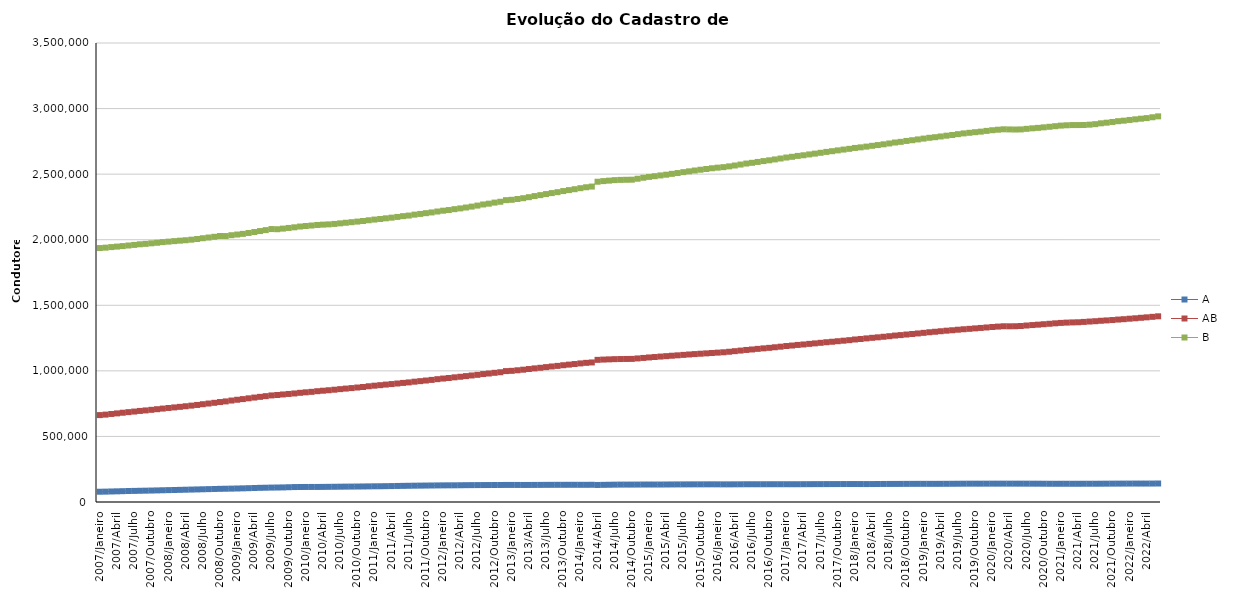
| Category | A | AB | B |
|---|---|---|---|
| 2007/Janeiro | 78339 | 662687 | 1936381 |
| 2007/Fevereiro | 79078 | 666322 | 1939479 |
| 2007/Março | 80256 | 671259 | 1943715 |
| 2007/Abril | 81364 | 675754 | 1947564 |
| 2007/Maio | 82551 | 680772 | 1951491 |
| 2007/Junho | 83749 | 685305 | 1955838 |
| 2007/Julho | 84645 | 689669 | 1960327 |
| 2007/Agosto | 85630 | 694408 | 1965165 |
| 2007/Setembro | 86399 | 698346 | 1968387 |
| 2007/Outubro | 87316 | 702912 | 1972538 |
| 2007/Novembro | 88339 | 707624 | 1976788 |
| 2007/Dezembro | 89528 | 712351 | 1981782 |
| 2008/Janeiro | 90600 | 716994 | 1985306 |
| 2008/Fevereiro | 91598 | 721215 | 1989171 |
| 2008/Março | 92619 | 725560 | 1992712 |
| 2008/Abril | 93708 | 730139 | 1995923 |
| 2008/Maio | 94834 | 734945 | 2000343 |
| 2008/Junho | 95853 | 739988 | 2005357 |
| 2008/Julho | 97010 | 745721 | 2011362 |
| 2008/Agosto | 98183 | 750891 | 2016749 |
| 2008/Setembro | 99339 | 756352 | 2022267 |
| 2008/Outubro | 100406 | 762253 | 2028505 |
| 2008/Novembro | 101206 | 767035 | 2027963 |
| 2008/Dezembro | 101984 | 773761 | 2034277 |
| 2009/Janeiro | 103037 | 779599 | 2039448 |
| 2009/Fevereiro | 104093 | 784637 | 2044637 |
| 2009/Março | 105435 | 790605 | 2051447 |
| 2009/Abril | 106757 | 796329 | 2058576 |
| 2009/Maio | 108079 | 801836 | 2065963 |
| 2009/Junho | 108964 | 807138 | 2073013 |
| 2009/Julho | 109948 | 812681 | 2081324 |
| 2009/Agosto | 110476 | 815980 | 2079988 |
| 2009/Setembro | 111217 | 820035 | 2084657 |
| 2009/Outubro | 112605 | 823940 | 2089744 |
| 2009/Novembro | 113921 | 827629 | 2094557 |
| 2009/Dezembro | 114420 | 832595 | 2100453 |
| 2010/Janeiro | 114636 | 836465 | 2104634 |
| 2010/Fevereiro | 114770 | 839928 | 2108253 |
| 2010/Março | 114809 | 844821 | 2112440 |
| 2010/Abril | 115140 | 848547 | 2115005 |
| 2010/Maio | 115639 | 852175 | 2117066 |
| 2010/Junho | 116176 | 856224 | 2120380 |
| 2010/Julho | 116713 | 860603 | 2124778 |
| 2010/Agosto | 117242 | 864813 | 2129320 |
| 2010/Setembro | 117593 | 868600 | 2133645 |
| 2010/Outubro | 118048 | 872947 | 2138176 |
| 2010/Novembro | 118496 | 877093 | 2142847 |
| 2010/Dezembro | 119150 | 882503 | 2148315 |
| 2011/Janeiro | 119745 | 886853 | 2153596 |
| 2011/Fevereiro | 120114 | 890841 | 2157800 |
| 2011/Março | 120776 | 895331 | 2163141 |
| 2011/Abril | 121472 | 899305 | 2168170 |
| 2011/Maio | 122333 | 903633 | 2173821 |
| 2011/Junho | 123012 | 908086 | 2179733 |
| 2011/Julho | 123705 | 911994 | 2184166 |
| 2011/Agosto | 124386 | 917379 | 2191164 |
| 2011/Setembro | 124879 | 921583 | 2196566 |
| 2011/Outubro | 125381 | 926225 | 2202361 |
| 2011/Novembro | 125899 | 931073 | 2208147 |
| 2011/Dezembro | 126447 | 936539 | 2215021 |
| 2012/Janeiro | 126877 | 941330 | 2221296 |
| 2012/Fevereiro | 127117 | 945491 | 2226229 |
| 2012/Março | 127325 | 950538 | 2232874 |
| 2012/Abril | 127754 | 954904 | 2238686 |
| 2012/Maio | 128324 | 959959 | 2245535 |
| 2012/Junho | 128674 | 964784 | 2252453 |
| 2012/Julho | 128992 | 969723 | 2260185 |
| 2012/Agosto | 129202 | 975564 | 2268721 |
| 2012/Setembro | 129369 | 979853 | 2274812 |
| 2012/Outubro | 129609 | 985089 | 2282984 |
| 2012/Novembro | 129852 | 989534 | 2289455 |
| 2012/Dezembro | 130177 | 998134 | 2301652 |
| 2013/Janeiro | 130177 | 1000109 | 2304385 |
| 2013/Fevereiro | 130095 | 1004448 | 2310305 |
| 2013/Março | 129977 | 1008890 | 2316513 |
| 2013/Abril | 130057 | 1013931 | 2324401 |
| 2013/Maio | 130271 | 1019012 | 2332676 |
| 2013/Junho | 130450 | 1023409 | 2339994 |
| 2013/Julho | 130824 | 1028635 | 2347900 |
| 2013/Agosto | 130907 | 1033465 | 2355508 |
| 2013/Setembro | 131043 | 1037864 | 2362527 |
| 2013/Outubro | 131072 | 1042921 | 2370811 |
| 2013/Novembro | 131181 | 1047510 | 2378129 |
| 2013/Dezembro | 131206 | 1052033 | 2385013 |
| 2014/Janeiro | 131020 | 1056842 | 2392930 |
| 2014/Fevereiro | 131018 | 1061116 | 2400045 |
| 2014/Março | 131336 | 1064144 | 2405258 |
| 2014/Abril | 129907 | 1083870 | 2442146 |
| 2014/Maio | 130816 | 1086012 | 2446827 |
| 2014/Junho | 131467 | 1087632 | 2450492 |
| 2014/Julho | 132197 | 1089225 | 2454305 |
| 2014/Agosto | 132620 | 1090172 | 2456182 |
| 2014/Setembro | 132697 | 1090725 | 2457019 |
| 2014/Outubro | 132727 | 1091227 | 2457710 |
| 2014/Novembro | 132891 | 1094797 | 2464958 |
| 2014/Dezembro | 133251 | 1098545 | 2472458 |
| 2015/Janeiro | 133298 | 1102270 | 2479080 |
| 2015/Fevereiro | 133180 | 1105433 | 2484369 |
| 2015/Março | 133225 | 1108992 | 2490262 |
| 2015/Abril | 133523 | 1112151 | 2495742 |
| 2015/Maio | 133833 | 1115341 | 2502194 |
| 2015/Junho | 134104 | 1118428 | 2508287 |
| 2015/Julho | 134244 | 1121823 | 2515190 |
| 2015/Agosto | 134423 | 1124901 | 2521371 |
| 2015/Setembro | 134554 | 1127863 | 2527684 |
| 2015/Outubro | 134596 | 1130651 | 2533689 |
| 2015/Novembro | 134707 | 1133268 | 2539097 |
| 2015/Dezembro | 134791 | 1136302 | 2544855 |
| 2016/Janeiro | 134685 | 1139015 | 2549436 |
| 2016/Fevereiro | 134529 | 1141730 | 2553241 |
| 2016/Março | 134494 | 1145666 | 2559223 |
| 2016/Abril | 134753 | 1150141 | 2565920 |
| 2016/Maio | 135029 | 1154632 | 2573181 |
| 2016/Junho | 135293 | 1159439 | 2580806 |
| 2016/Julho | 135348 | 1163140 | 2586364 |
| 2016/Agosto | 135308 | 1167635 | 2592983 |
| 2016/Setembro | 135361 | 1171584 | 2599490 |
| 2016/Outubro | 135459 | 1175390 | 2605483 |
| 2016/Novembro | 135506 | 1179900 | 2612210 |
| 2016/Dezembro | 135514 | 1184269 | 2619190 |
| 2017/Janeiro | 135474 | 1189318 | 2626642 |
| 2017/Fevereiro | 135452 | 1193110 | 2632203 |
| 2017/Março | 135549 | 1197730 | 2639116 |
| 2017/Abril | 135741 | 1201230 | 2643952 |
| 2017/Maio | 135967 | 1205702 | 2650431 |
| 2017/Junho | 136222 | 1209617 | 2656401 |
| 2017/Julho | 136297 | 1213836 | 2662849 |
| 2017/Agosto | 136491 | 1218317 | 2669583 |
| 2017/Setembro | 136610 | 1221972 | 2674979 |
| 2017/Outubro | 136732 | 1226007 | 2681228 |
| 2017/Novembro | 136877 | 1230013 | 2687352 |
| 2017/Dezembro | 136941 | 1234077 | 2692944 |
| 2018/Janeiro | 136961 | 1239230 | 2699845 |
| 2018/Fevereiro | 136861 | 1243077 | 2704334 |
| 2018/Março | 136746 | 1247604 | 2710001 |
| 2018/Abril | 136874 | 1251918 | 2716059 |
| 2018/Maio | 137200 | 1255730 | 2721619 |
| 2018/Junho | 137503 | 1259988 | 2727492 |
| 2018/Julho | 137733 | 1264253 | 2733946 |
| 2018/Agosto | 137877 | 1269144 | 2741222 |
| 2018/Setembro | 138022 | 1272687 | 2746265 |
| 2018/Outubro | 138260 | 1277095 | 2753331 |
| 2018/Novembro | 138357 | 1281157 | 2758661 |
| 2018/Dezembro | 138482 | 1285338 | 2764827 |
| 2019/Janeiro | 138567 | 1289892 | 2771065 |
| 2019/Fevereiro | 138472 | 1294437 | 2777166 |
| 2019/Março | 138417 | 1298173 | 2781670 |
| 2019/Abril | 138618 | 1302208 | 2787397 |
| 2019/Maio | 138760 | 1306323 | 2793240 |
| 2019/Junho | 139011 | 1309692 | 2798618 |
| 2019/Julho | 139239 | 1313680 | 2804890 |
| 2019/Agosto | 139569 | 1317278 | 2810587 |
| 2019/Setembro | 139756 | 1320449 | 2815306 |
| 2019/Outubro | 139787 | 1323920 | 2819853 |
| 2019/Novembro | 139735 | 1327263 | 2824127 |
| 2019/Dezembro | 139824 | 1330819 | 2829812 |
| 2020/Janeiro | 139929 | 1334470 | 2834887 |
| 2020/Fevereiro | 139894 | 1337574 | 2838808 |
| 2020/Março | 139951 | 1340104 | 2841932 |
| 2020/Abril | 139919 | 1339824 | 2841009 |
| 2020/Maio | 139902 | 1340245 | 2840191 |
| 2020/Junho | 139889 | 1342033 | 2841071 |
| 2020/Julho | 139803 | 1345740 | 2845449 |
| 2020/Agosto | 139693 | 1349110 | 2849373 |
| 2020/Setembro | 139589 | 1352188 | 2852770 |
| 2020/Outubro | 139319 | 1355676 | 2856887 |
| 2020/Novembro | 139098 | 1358973 | 2861095 |
| 2020/Dezembro | 139013 | 1362484 | 2865653 |
| 2021/Janeiro | 139086 | 1365670 | 2870052 |
| 2021/Fevereiro | 139086 | 1367895 | 2872522 |
| 2021/Março | 138954 | 1369419 | 2874146 |
| 2021/Abril | 138994 | 1370569 | 2874213 |
| 2021/Maio | 139257 | 1373216 | 2874859 |
| 2021/Junho | 139250 | 1376096 | 2877343 |
| 2021/Julho | 139307 | 1378589 | 2881041 |
| 2021/Agosto | 139516 | 1382023 | 2887617 |
| 2021/Setembro | 139723 | 1384618 | 2892454 |
| 2021/Outubro | 139949 | 1387507 | 2897878 |
| 2021/Novembro | 140126 | 1391124 | 2903782 |
| 2021/Dezembro | 140308 | 1394019 | 2907772 |
| 2022/Janeiro | 140429 | 1397712 | 2913171 |
| 2022/Fevereiro | 140557 | 1400889 | 2918003 |
| 2022/Março | 140543 | 1404658 | 2922811 |
| 2022/Abril | 140580 | 1408106 | 2927322 |
| 2022/Maio | 140663 | 1411921 | 2933783 |
| 2022/Junho | 141107 | 1415906 | 2940678 |